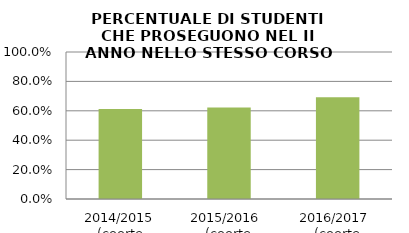
| Category | 2014/2015 (coorte 2013/14) 2015/2016  (coorte 2014/15) 2016/2017  (coorte 2015/16) |
|---|---|
| 2014/2015 (coorte 2013/14) | 0.613 |
| 2015/2016  (coorte 2014/15) | 0.622 |
| 2016/2017  (coorte 2015/16) | 0.692 |